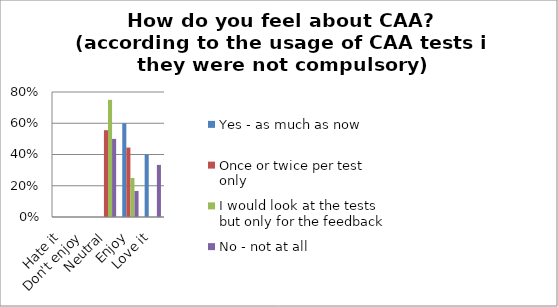
| Category | Yes - as much as now | Once or twice per test only | I would look at the tests but only for the feedback | No - not at all |
|---|---|---|---|---|
| Hate it | 0 | 0 | 0 | 0 |
| Don't enjoy | 0 | 0 | 0 | 0 |
| Neutral | 0 | 0.556 | 0.75 | 0.5 |
| Enjoy | 0.6 | 0.444 | 0.25 | 0.167 |
| Love it | 0.4 | 0 | 0 | 0.333 |